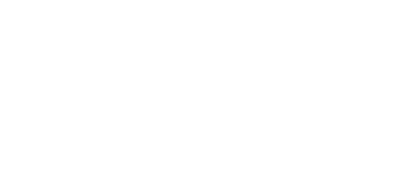
| Category | Series 0 |
|---|---|
| ORÇAMENTO | 0 |
| REALIZADO | 0 |